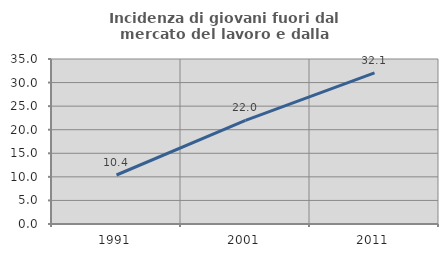
| Category | Incidenza di giovani fuori dal mercato del lavoro e dalla formazione  |
|---|---|
| 1991.0 | 10.394 |
| 2001.0 | 21.978 |
| 2011.0 | 32.061 |